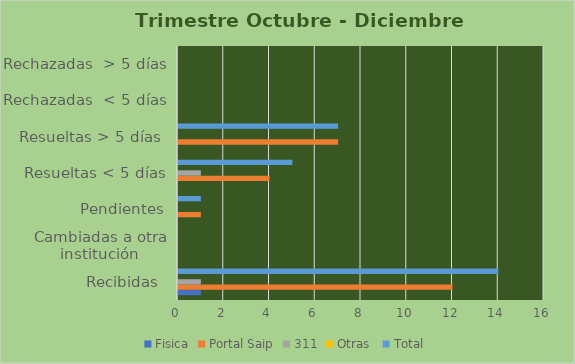
| Category | Fisica | Portal Saip | 311 | Otras  | Total |
|---|---|---|---|---|---|
| Recibidas  | 1 | 12 | 1 | 0 | 14 |
| Cambiadas a otra institución | 0 | 0 | 0 | 0 | 0 |
| Pendientes | 0 | 1 | 0 | 0 | 1 |
| Resueltas < 5 días | 0 | 4 | 1 | 0 | 5 |
| Resueltas > 5 días  | 0 | 7 | 0 | 0 | 7 |
| Rechazadas  < 5 días | 0 | 0 | 0 | 0 | 0 |
| Rechazadas  > 5 días | 0 | 0 | 0 | 0 | 0 |